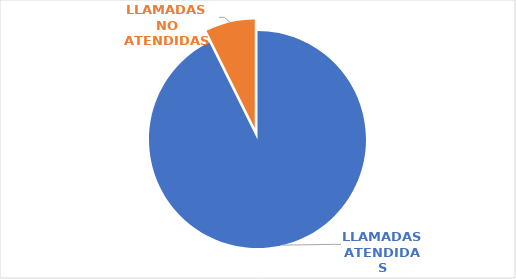
| Category | Series 0 |
|---|---|
| LLAMADAS ATENDIDAS | 26031 |
| LLAMADAS NO ATENDIDAS | 2061 |